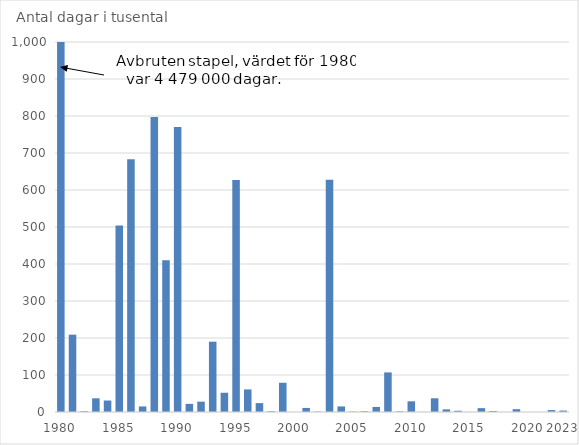
| Category | Antal dagar i tusental |
|---|---|
| 1980.0 | 1000 |
| nan | 209 |
| nan | 2 |
| nan | 37 |
| nan | 31 |
| 1985.0 | 504 |
| nan | 683 |
| nan | 15 |
| nan | 797 |
| nan | 410 |
| 1990.0 | 770 |
| nan | 22 |
| nan | 28 |
| nan | 190 |
| nan | 52 |
| 1995.0 | 627 |
| nan | 61 |
| nan | 24 |
| nan | 2 |
| nan | 79 |
| 2000.0 | 0 |
| nan | 11 |
| nan | 1 |
| nan | 628 |
| nan | 15 |
| 2005.0 | 1 |
| nan | 2 |
| nan | 13.7 |
| nan | 107 |
| nan | 1.6 |
| 2010.0 | 28.9 |
| nan | 0.254 |
| nan | 37.1 |
| nan | 7.1 |
| nan | 3.4 |
| 2015.0 | 0.234 |
| nan | 10.417 |
| nan | 2.57 |
| nan | 0.05 |
| nan | 7.58 |
| 2020.0 | 0 |
| nan | 0.011 |
| nan | 5.2 |
| 2023.0 | 3.909 |